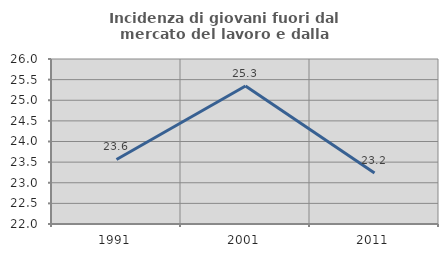
| Category | Incidenza di giovani fuori dal mercato del lavoro e dalla formazione  |
|---|---|
| 1991.0 | 23.564 |
| 2001.0 | 25.347 |
| 2011.0 | 23.238 |